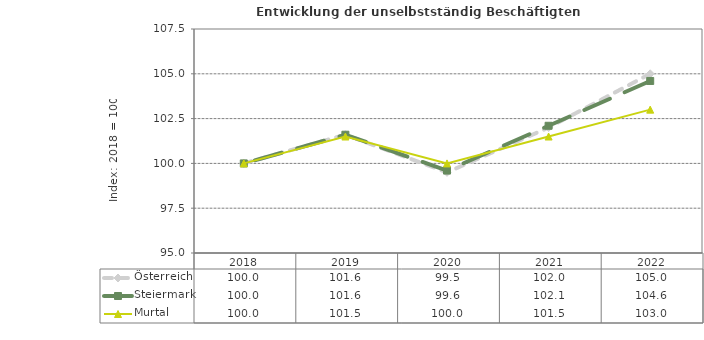
| Category | Österreich | Steiermark | Murtal |
|---|---|---|---|
| 2022.0 | 105 | 104.6 | 103 |
| 2021.0 | 102 | 102.1 | 101.5 |
| 2020.0 | 99.5 | 99.6 | 100 |
| 2019.0 | 101.6 | 101.6 | 101.5 |
| 2018.0 | 100 | 100 | 100 |